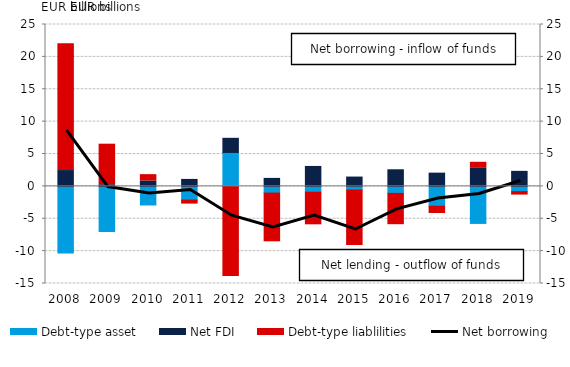
| Category | Debt-type asset | Net FDI | Debt-type liablilities |
|---|---|---|---|
| 2008.0 | -10.309 | 2.445 | 19.587 |
| 2009.0 | -6.97 | 0.259 | 6.258 |
| 2010.0 | -2.87 | 0.835 | 0.976 |
| 2011.0 | -2.116 | 1.076 | -0.621 |
| 2012.0 | 5.24 | 2.183 | -13.932 |
| 2013.0 | -1.033 | 1.232 | -7.528 |
| 2014.0 | -0.901 | 3.078 | -5.035 |
| 2015.0 | -0.567 | 1.438 | -8.546 |
| 2016.0 | -1.078 | 2.563 | -4.841 |
| 2017.0 | -3.063 | 2.044 | -1.126 |
| 2018.0 | -5.72 | 2.781 | 0.94 |
| 2019.0 | -0.818 | 2.32 | -0.528 |